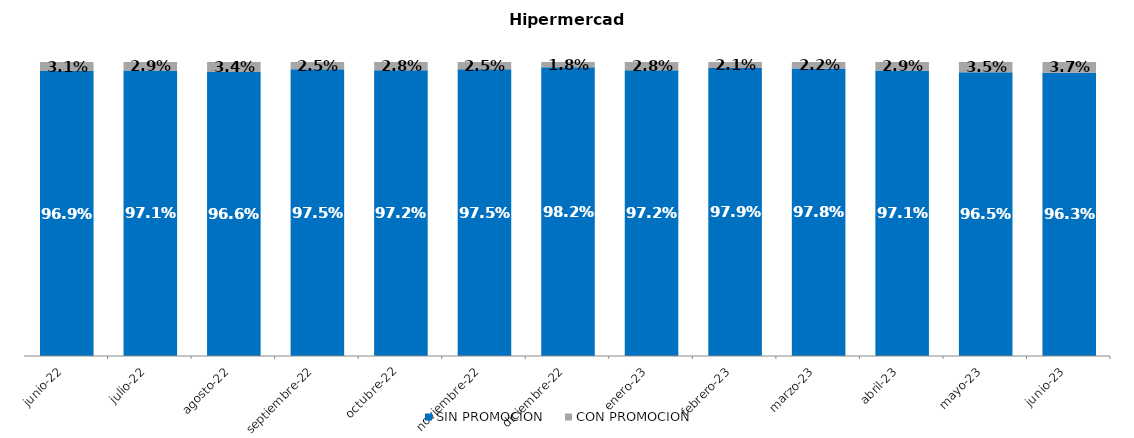
| Category | SIN PROMOCION   | CON PROMOCION   |
|---|---|---|
| 2022-06-01 | 0.969 | 0.031 |
| 2022-07-01 | 0.971 | 0.029 |
| 2022-08-01 | 0.966 | 0.034 |
| 2022-09-01 | 0.975 | 0.025 |
| 2022-10-01 | 0.972 | 0.028 |
| 2022-11-01 | 0.975 | 0.025 |
| 2022-12-01 | 0.982 | 0.018 |
| 2023-01-01 | 0.972 | 0.028 |
| 2023-02-01 | 0.979 | 0.021 |
| 2023-03-01 | 0.978 | 0.022 |
| 2023-04-01 | 0.971 | 0.029 |
| 2023-05-01 | 0.965 | 0.035 |
| 2023-06-01 | 0.963 | 0.037 |